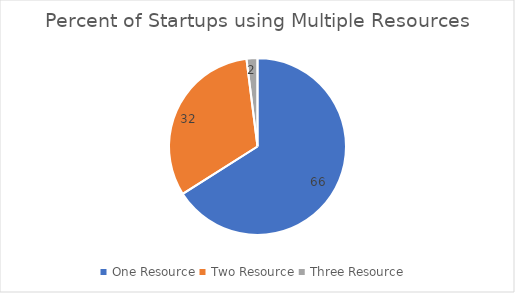
| Category | Series 0 |
|---|---|
| One Resource | 66 |
| Two Resource | 32 |
| Three Resource  | 2 |